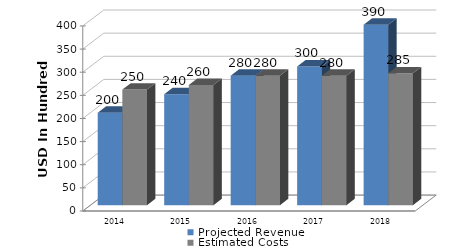
| Category | Projected Revenue | Estimated Costs |
|---|---|---|
| 2014.0 | 200 | 250 |
| 2015.0 | 240 | 260 |
| 2016.0 | 280 | 280 |
| 2017.0 | 300 | 280 |
| 2018.0 | 390 | 285 |